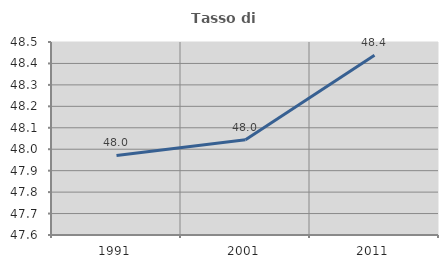
| Category | Tasso di occupazione   |
|---|---|
| 1991.0 | 47.971 |
| 2001.0 | 48.045 |
| 2011.0 | 48.439 |